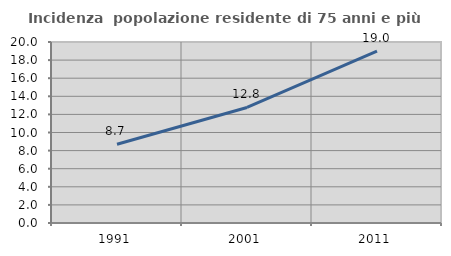
| Category | Incidenza  popolazione residente di 75 anni e più |
|---|---|
| 1991.0 | 8.708 |
| 2001.0 | 12.766 |
| 2011.0 | 18.985 |